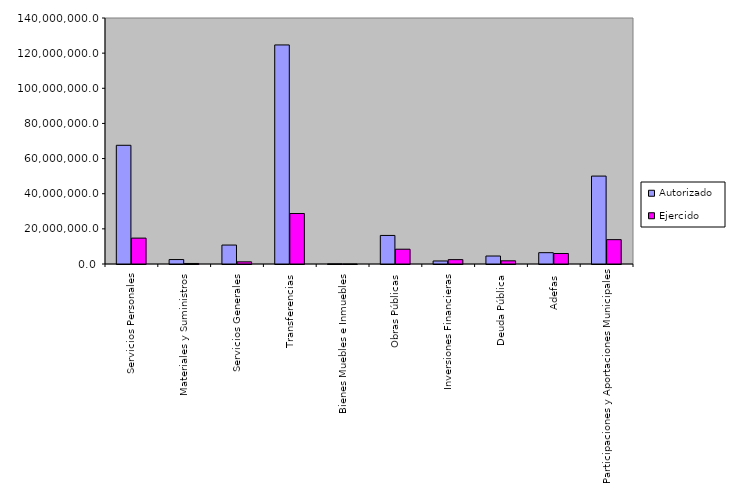
| Category | Autorizado | Ejercido |
|---|---|---|
| 0 | 67555296.6 | 14731899.7 |
| 1 | 2531108.6 | 298631.1 |
| 2 | 10779101.4 | 1219819.3 |
| 3 | 124668846.9 | 28729165.6 |
| 4 | 85214.2 | 99.6 |
| 5 | 16247297.2 | 8415516.8 |
| 6 | 1722832 | 2485498.4 |
| 7 | 4541774.766 | 1804928.89 |
| 8 | 6442504.4 | 5961419.3 |
| 9 | 50035957.4 | 13862162.1 |